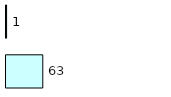
| Category | Series 0 | Series 1 |
|---|---|---|
| 0 | 63 | 1 |